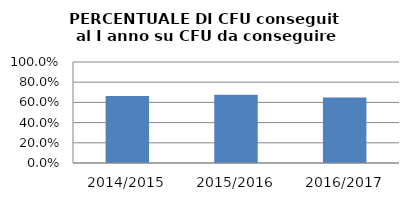
| Category | 2014/2015 2015/2016 2016/2017 |
|---|---|
| 2014/2015 | 0.663 |
| 2015/2016 | 0.676 |
| 2016/2017 | 0.648 |